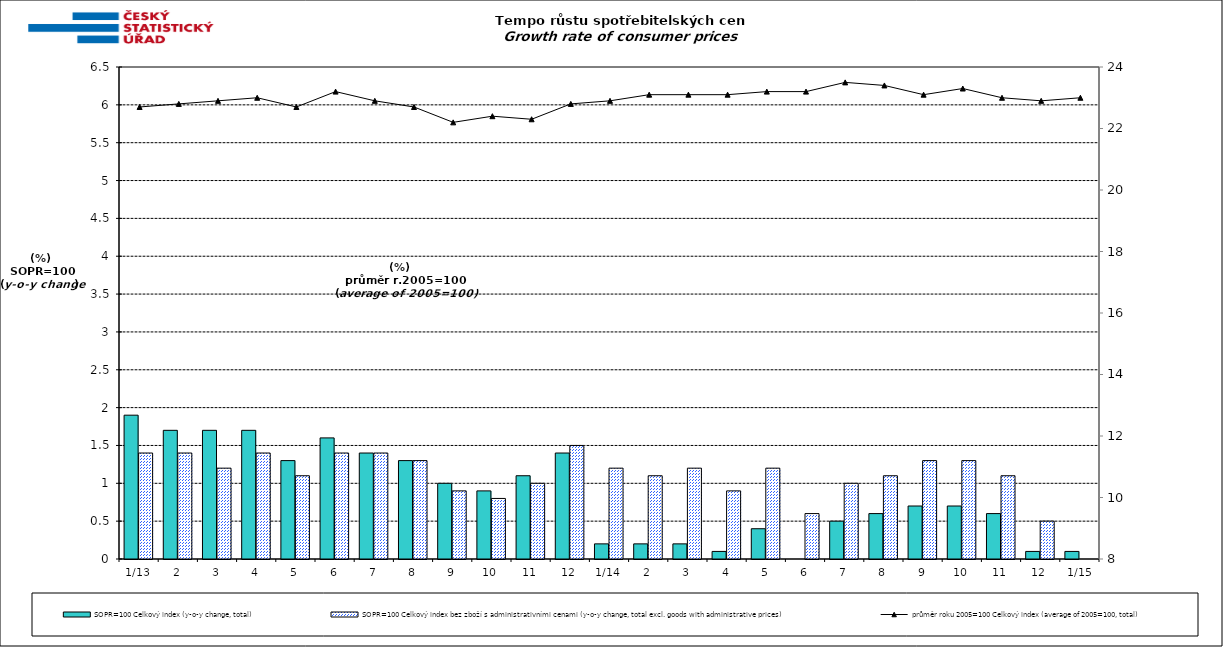
| Category | SOPR=100 Celkový index (y-o-y change, total) | SOPR=100 Celkový index bez zboží s administrativními cenami (y-o-y change, total excl. goods with administrative prices)  |
|---|---|---|
| 1/13 | 1.9 | 1.4 |
| 2 | 1.7 | 1.4 |
| 3 | 1.7 | 1.2 |
| 4 | 1.7 | 1.4 |
| 5 | 1.3 | 1.1 |
| 6 | 1.6 | 1.4 |
| 7 | 1.4 | 1.4 |
| 8 | 1.3 | 1.3 |
| 9 | 1 | 0.9 |
| 10 | 0.9 | 0.8 |
| 11 | 1.1 | 1 |
| 12 | 1.4 | 1.5 |
| 1/14 | 0.2 | 1.2 |
| 2 | 0.2 | 1.1 |
| 3 | 0.2 | 1.2 |
| 4 | 0.1 | 0.9 |
| 5 | 0.4 | 1.2 |
| 6 | 0 | 0.6 |
| 7 | 0.5 | 1 |
| 8 | 0.6 | 1.1 |
| 9 | 0.7 | 1.3 |
| 10 | 0.7 | 1.3 |
| 11 | 0.6 | 1.1 |
| 12 | 0.1 | 0.5 |
|  1/15 | 0.1 | 0 |